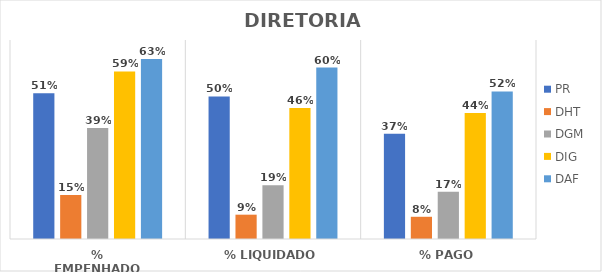
| Category | PR | DHT | DGM | DIG | DAF |
|---|---|---|---|---|---|
| % EMPENHADO | 0.513 | 0.154 | 0.39 | 0.59 | 0.633 |
| % LIQUIDADO | 0.501 | 0.086 | 0.189 | 0.461 | 0.603 |
| % PAGO | 0.37 | 0.078 | 0.166 | 0.443 | 0.519 |